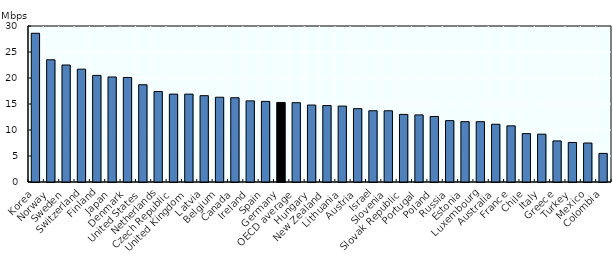
| Category | Series 0 |
|---|---|
| Korea | 28.6 |
| Norway | 23.5 |
| Sweden | 22.5 |
| Switzerland | 21.7 |
| Finland | 20.5 |
| Japan | 20.2 |
| Denmark | 20.1 |
| United States | 18.7 |
| Netherlands | 17.4 |
| Czech Republic | 16.9 |
| United Kingdom | 16.9 |
| Latvia | 16.6 |
| Belgium | 16.3 |
| Canada | 16.2 |
| Ireland | 15.6 |
| Spain | 15.5 |
| Germany | 15.3 |
| OECD average | 15.25 |
| Hungary | 14.8 |
| New Zealand | 14.7 |
| Lithuania | 14.6 |
| Austria | 14.1 |
| Israel | 13.7 |
| Slovenia | 13.7 |
| Slovak Republic | 13 |
| Portugal | 12.9 |
| Poland | 12.6 |
| Russia | 11.8 |
| Estonia | 11.6 |
| Luxembourg | 11.6 |
| Australia | 11.1 |
| France | 10.8 |
| Chile | 9.3 |
| Italy | 9.2 |
| Greece | 7.9 |
| Turkey | 7.6 |
| Mexico | 7.5 |
| Colombia | 5.5 |